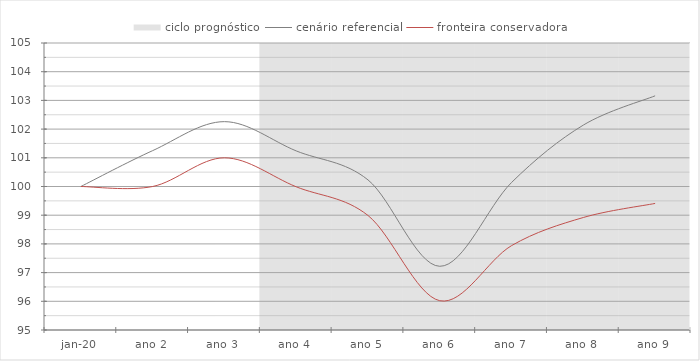
| Category | ciclo prognóstico |
|---|---|
| 0 | -110 |
| 1 | -110 |
| 2 | -110 |
| 3 | 110 |
| 4 | 110 |
| 5 | 110 |
| 6 | 110 |
| 7 | 110 |
| 8 | 110 |